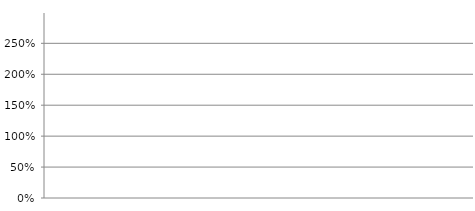
| Category | Bruttoverschuldungsanteil (Bruttoschulden / Laufender Ertrag) |
|---|---|
| 2018.0 | 0 |
| 2019.0 | 0 |
| 2020.0 | 0 |
| 2021.0 | 0 |
| 2022.0 | 0 |